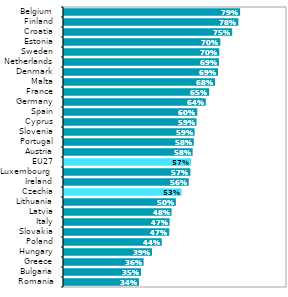
| Category | Series 1 |
|---|---|
| Romania | 0.336 |
| Bulgaria | 0.345 |
| Greece | 0.357 |
| Hungary | 0.395 |
| Poland | 0.438 |
| Slovakia | 0.472 |
| Italy | 0.474 |
| Latvia | 0.482 |
| Lithuania | 0.502 |
| Czechia | 0.528 |
| Ireland | 0.56 |
| Luxembourg  | 0.567 |
| EU27 | 0.57 |
| Austria | 0.577 |
| Portugal | 0.582 |
| Slovenia | 0.586 |
| Cyprus | 0.594 |
| Spain | 0.598 |
| Germany | 0.636 |
| France | 0.651 |
| Malta | 0.677 |
| Denmark | 0.691 |
| Netherlands | 0.695 |
| Sweden | 0.696 |
| Estonia | 0.701 |
| Croatia | 0.754 |
| Finland | 0.782 |
| Belgium | 0.79 |